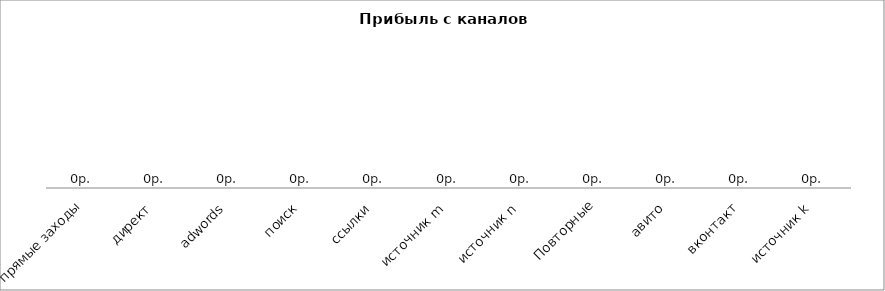
| Category | Денег в кассе с канала |
|---|---|
| прямые заходы | 0 |
| директ | 0 |
| adwords | 0 |
| поиск | 0 |
| ссылки | 0 |
| источник m | 0 |
| источник n | 0 |
| Повторные | 0 |
| авито | 0 |
| вконтакт | 0 |
| источник k | 0 |